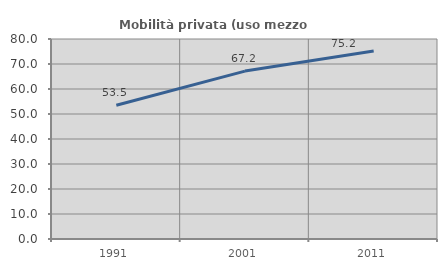
| Category | Mobilità privata (uso mezzo privato) |
|---|---|
| 1991.0 | 53.484 |
| 2001.0 | 67.162 |
| 2011.0 | 75.237 |